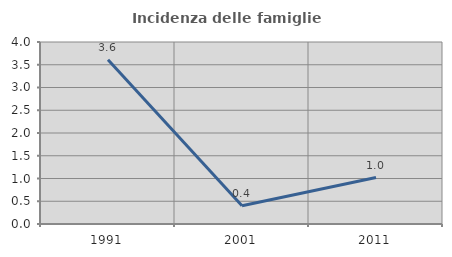
| Category | Incidenza delle famiglie numerose |
|---|---|
| 1991.0 | 3.61 |
| 2001.0 | 0.402 |
| 2011.0 | 1.02 |